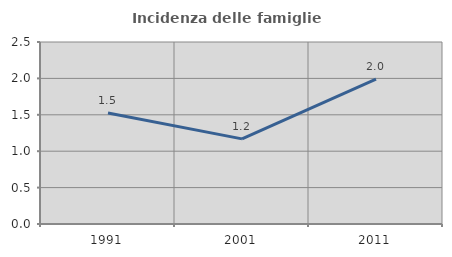
| Category | Incidenza delle famiglie numerose |
|---|---|
| 1991.0 | 1.524 |
| 2001.0 | 1.17 |
| 2011.0 | 1.989 |